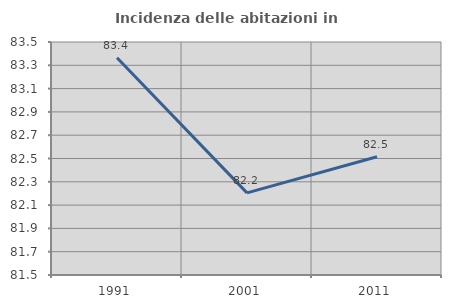
| Category | Incidenza delle abitazioni in proprietà  |
|---|---|
| 1991.0 | 83.364 |
| 2001.0 | 82.205 |
| 2011.0 | 82.514 |